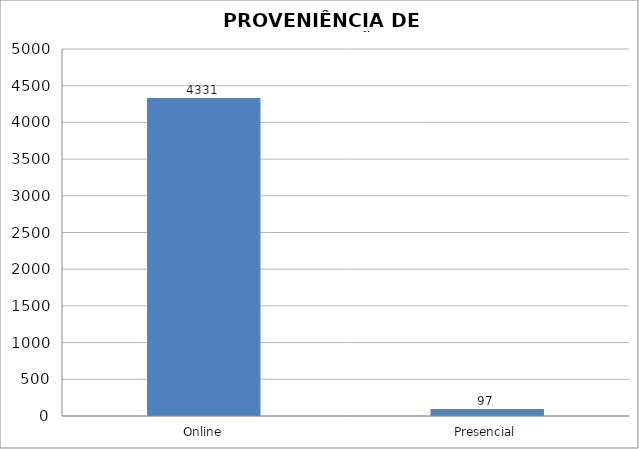
| Category | Series 0 |
|---|---|
| Online | 4331 |
| Presencial | 97 |